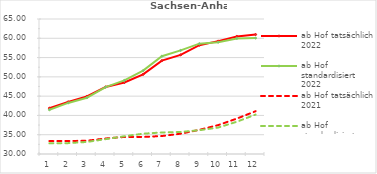
| Category | ab Hof tatsächlich 2022 | ab Hof standardisiert 2022 | ab Hof tatsächlich 2021 | ab Hof standardisiert 2021 |
|---|---|---|---|---|
| 0 | 41.873 | 41.473 | 33.346 | 32.763 |
| 1 | 43.517 | 43.239 | 33.375 | 32.819 |
| 2 | 44.921 | 44.595 | 33.435 | 33.125 |
| 3 | 47.375 | 47.333 | 34.027 | 33.853 |
| 4 | 48.552 | 49.093 | 34.421 | 34.6 |
| 5 | 50.656 | 51.616 | 34.42 | 35.265 |
| 6 | 54.2 | 55.355 | 34.654 | 35.586 |
| 7 | 55.701 | 56.86 | 35.262 | 35.718 |
| 8 | 58.216 | 58.601 | 36.266 | 36.174 |
| 9 | 59.26 | 58.986 | 37.484 | 36.85 |
| 10 | 60.484 | 59.965 | 39.179 | 38.373 |
| 11 | 60.976 | 60.048 | 41.097 | 40.22 |